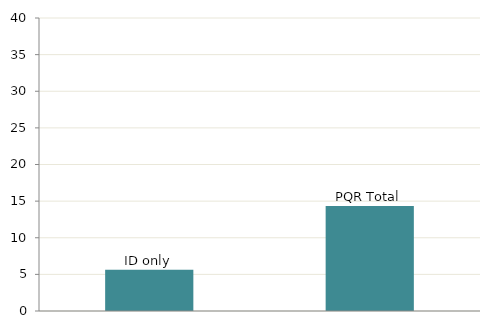
| Category | Series 0 |
|---|---|
| PQR Total | 14.337 |
| ID only | 5.639 |